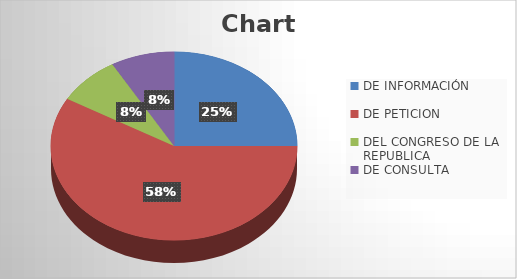
| Category | Series 0 |
|---|---|
| DE INFORMACIÓN | 3 |
| DE PETICION | 7 |
| DEL CONGRESO DE LA REPUBLICA | 1 |
| DE CONSULTA | 1 |